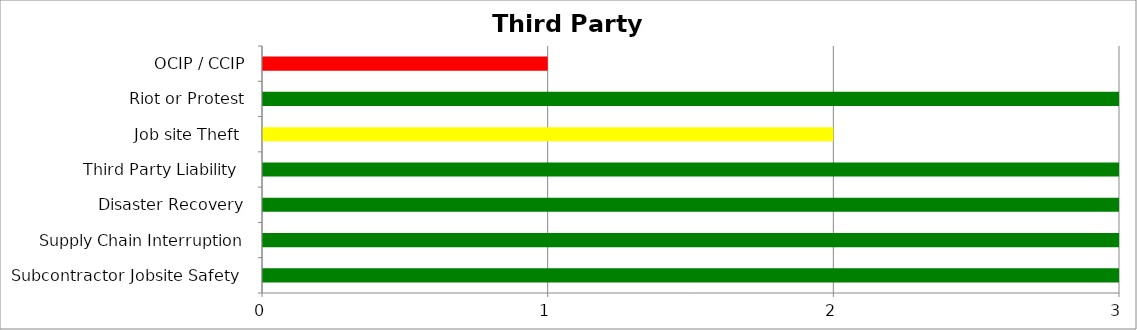
| Category | Low | Medium | High |
|---|---|---|---|
| Subcontractor Jobsite Safety  | 3 | 0 | 0 |
| Supply Chain Interruption | 3 | 0 | 0 |
| Disaster Recovery | 3 | 0 | 0 |
| Third Party Liability  | 3 | 0 | 0 |
| Job site Theft  | 0 | 2 | 0 |
| Riot or Protest | 3 | 0 | 0 |
| OCIP / CCIP | 0 | 0 | 1 |